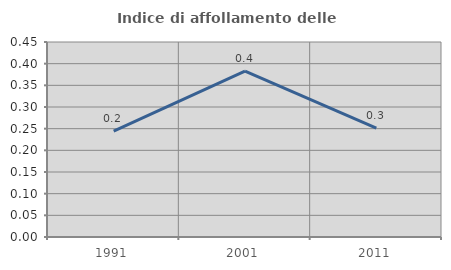
| Category | Indice di affollamento delle abitazioni  |
|---|---|
| 1991.0 | 0.244 |
| 2001.0 | 0.383 |
| 2011.0 | 0.251 |